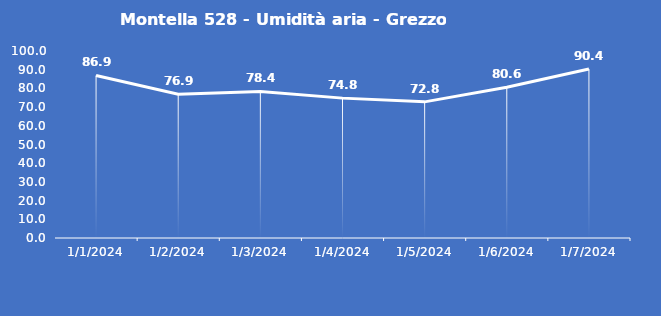
| Category | Montella 528 - Umidità aria - Grezzo (%) |
|---|---|
| 1/1/24 | 86.9 |
| 1/2/24 | 76.9 |
| 1/3/24 | 78.4 |
| 1/4/24 | 74.8 |
| 1/5/24 | 72.8 |
| 1/6/24 | 80.6 |
| 1/7/24 | 90.4 |